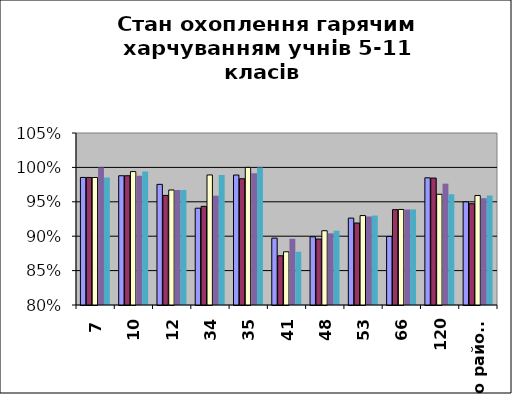
| Category | Series 0 | Series 1 | Series 2 | Series 3 | Series 4 |
|---|---|---|---|---|---|
| 7 | 0.985 | 0.985 | 0.985 | 1 | 0.985 |
| 10 | 0.988 | 0.988 | 0.994 | 0.988 | 0.994 |
| 12 | 0.975 | 0.959 | 0.967 | 0.967 | 0.967 |
| 34 | 0.941 | 0.943 | 0.989 | 0.959 | 0.989 |
| 35 | 0.989 | 0.984 | 1 | 0.992 | 1 |
| 41 | 0.897 | 0.872 | 0.877 | 0.896 | 0.877 |
| 48 | 0.899 | 0.896 | 0.908 | 0.904 | 0.908 |
| 53 | 0.926 | 0.919 | 0.93 | 0.929 | 0.93 |
| 66 | 0.9 | 0.939 | 0.939 | 0.939 | 0.939 |
| 120 | 0.985 | 0.984 | 0.961 | 0.976 | 0.961 |
| по району | 0.95 | 0.947 | 0.959 | 0.955 | 0.959 |